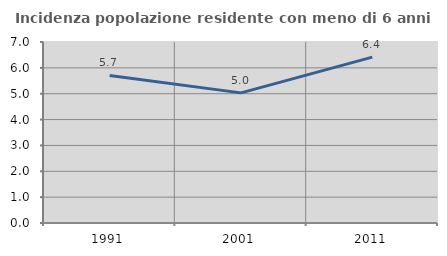
| Category | Incidenza popolazione residente con meno di 6 anni |
|---|---|
| 1991.0 | 5.705 |
| 2001.0 | 5.032 |
| 2011.0 | 6.414 |